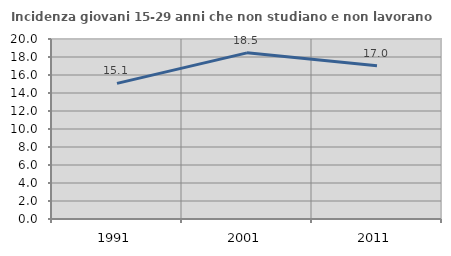
| Category | Incidenza giovani 15-29 anni che non studiano e non lavorano  |
|---|---|
| 1991.0 | 15.068 |
| 2001.0 | 18.462 |
| 2011.0 | 17.021 |